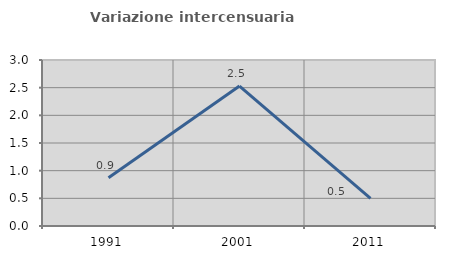
| Category | Variazione intercensuaria annua |
|---|---|
| 1991.0 | 0.873 |
| 2001.0 | 2.529 |
| 2011.0 | 0.5 |